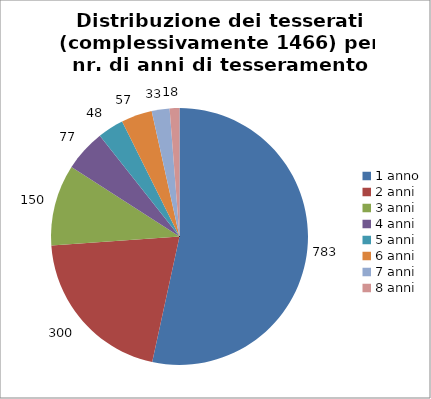
| Category | Nr. Tesserati |
|---|---|
| 1 anno | 783 |
| 2 anni | 300 |
| 3 anni | 150 |
| 4 anni | 77 |
| 5 anni | 48 |
| 6 anni | 57 |
| 7 anni | 33 |
| 8 anni | 18 |